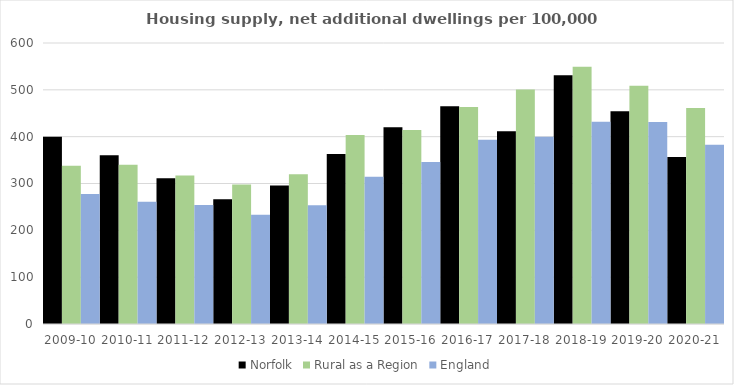
| Category | Norfolk | Rural as a Region | England |
|---|---|---|---|
| 2009-10 | 400.057 | 337.852 | 277.548 |
| 2010-11 | 360.16 | 340.105 | 260.994 |
| 2011-12 | 311.254 | 317.04 | 254.007 |
| 2012-13 | 266.174 | 297.763 | 233.153 |
| 2013-14 | 295.991 | 319.835 | 253.602 |
| 2014-15 | 362.781 | 403.796 | 314.256 |
| 2015-16 | 420.12 | 414.091 | 346.154 |
| 2016-17 | 464.938 | 463.209 | 393.256 |
| 2017-18 | 411.737 | 500.68 | 399.646 |
| 2018-19 | 531.272 | 549.491 | 432.099 |
| 2019-20 | 454.305 | 508.493 | 431.187 |
| 2020-21 | 356.549 | 461.114 | 382.827 |